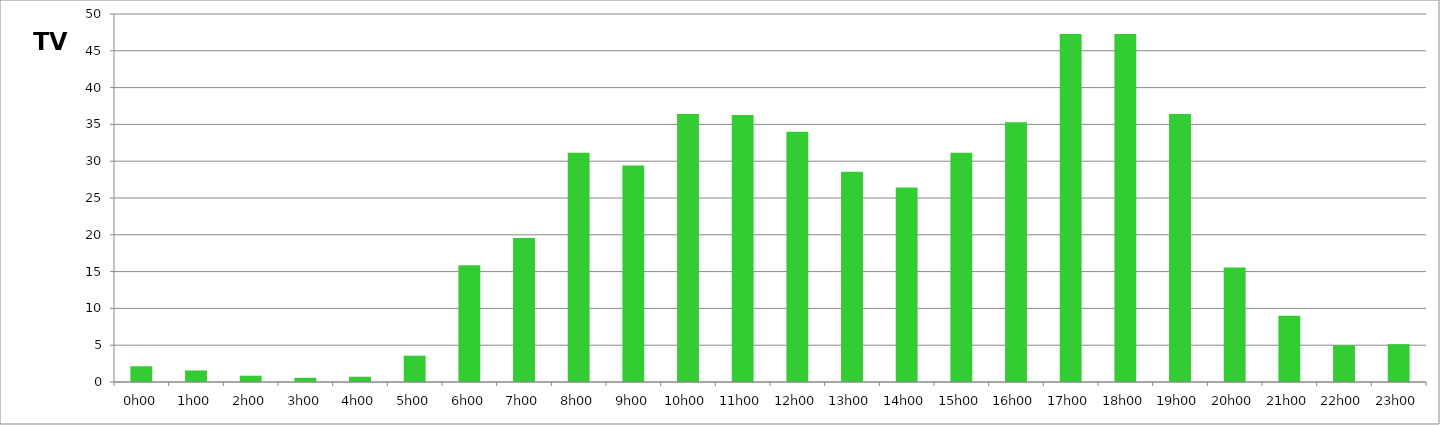
| Category | TV |
|---|---|
| 0.0 | 2.143 |
| 0.041666666666666664 | 1.571 |
| 0.08333333333333333 | 0.857 |
| 0.125 | 0.571 |
| 0.16666666666666666 | 0.714 |
| 0.20833333333333334 | 3.571 |
| 0.25 | 15.857 |
| 0.2916666666666667 | 19.571 |
| 0.3333333333333333 | 31.143 |
| 0.375 | 29.429 |
| 0.4166666666666667 | 36.429 |
| 0.4583333333333333 | 36.286 |
| 0.5 | 34 |
| 0.5416666666666666 | 28.571 |
| 0.5833333333333334 | 26.429 |
| 0.625 | 31.143 |
| 0.6666666666666666 | 35.286 |
| 0.7083333333333334 | 47.286 |
| 0.75 | 47.286 |
| 0.7916666666666666 | 36.429 |
| 0.8333333333333334 | 15.571 |
| 0.875 | 9 |
| 0.9166666666666666 | 5 |
| 0.9583333333333334 | 5.143 |